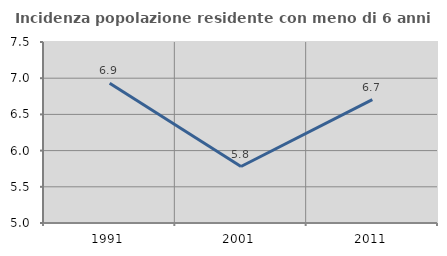
| Category | Incidenza popolazione residente con meno di 6 anni |
|---|---|
| 1991.0 | 6.93 |
| 2001.0 | 5.78 |
| 2011.0 | 6.705 |